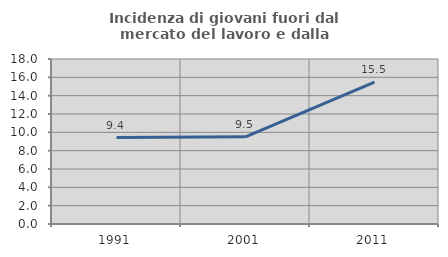
| Category | Incidenza di giovani fuori dal mercato del lavoro e dalla formazione  |
|---|---|
| 1991.0 | 9.428 |
| 2001.0 | 9.506 |
| 2011.0 | 15.476 |